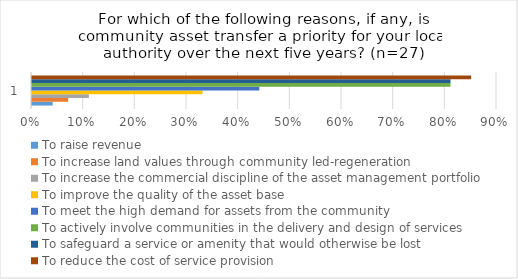
| Category | To raise revenue | To increase land values through community led-regeneration | To increase the commercial discipline of the asset management portfolio | To improve the quality of the asset base | To meet the high demand for assets from the community | To actively involve communities in the delivery and design of services | To safeguard a service or amenity that would otherwise be lost | To reduce the cost of service provision |
|---|---|---|---|---|---|---|---|---|
| 0 | 0.04 | 0.07 | 0.11 | 0.33 | 0.44 | 0.81 | 0.81 | 0.85 |